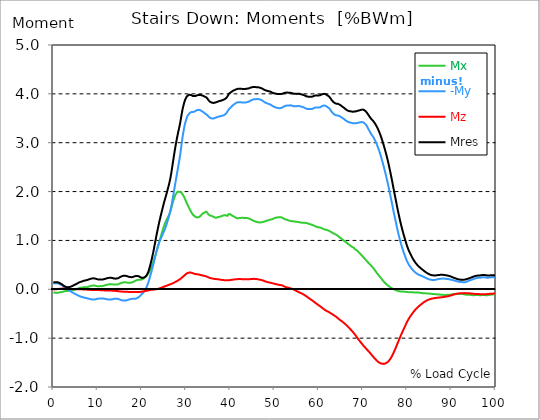
| Category |  Mx |  -My |  Mz |  Mres |
|---|---|---|---|---|
| 0.0 | -0.069 | 0.125 | -0.004 | 0.145 |
| 0.167348456675344 | -0.065 | 0.124 | -0.002 | 0.143 |
| 0.334696913350688 | -0.067 | 0.124 | -0.001 | 0.144 |
| 0.5020453700260321 | -0.072 | 0.125 | 0 | 0.147 |
| 0.669393826701376 | -0.074 | 0.124 | 0.002 | 0.147 |
| 0.83674228337672 | -0.074 | 0.123 | 0.004 | 0.145 |
| 1.0040907400520642 | -0.071 | 0.121 | 0.006 | 0.143 |
| 1.1621420602454444 | -0.068 | 0.117 | 0.007 | 0.137 |
| 1.3294905169207885 | -0.065 | 0.111 | 0.009 | 0.131 |
| 1.4968389735961325 | -0.064 | 0.105 | 0.011 | 0.124 |
| 1.6641874302714765 | -0.061 | 0.096 | 0.012 | 0.116 |
| 1.8315358869468206 | -0.058 | 0.088 | 0.013 | 0.107 |
| 1.9988843436221646 | -0.054 | 0.078 | 0.014 | 0.097 |
| 2.1662328002975086 | -0.05 | 0.066 | 0.014 | 0.086 |
| 2.333581256972853 | -0.044 | 0.052 | 0.013 | 0.073 |
| 2.5009297136481967 | -0.038 | 0.037 | 0.012 | 0.062 |
| 2.6682781703235405 | -0.036 | 0.024 | 0.012 | 0.055 |
| 2.8356266269988843 | -0.035 | 0.017 | 0.011 | 0.05 |
| 3.002975083674229 | -0.034 | 0.009 | 0.011 | 0.045 |
| 3.1703235403495724 | -0.033 | -0.001 | 0.01 | 0.043 |
| 3.337671997024917 | -0.033 | -0.011 | 0.01 | 0.043 |
| 3.4957233172182973 | -0.032 | -0.021 | 0.009 | 0.044 |
| 3.663071773893641 | -0.028 | -0.03 | 0.009 | 0.047 |
| 3.8304202305689854 | -0.025 | -0.039 | 0.008 | 0.051 |
| 3.997768687244329 | -0.023 | -0.048 | 0.007 | 0.056 |
| 4.165117143919673 | -0.021 | -0.057 | 0.007 | 0.063 |
| 4.332465600595017 | -0.018 | -0.066 | 0.007 | 0.071 |
| 4.499814057270361 | -0.015 | -0.076 | 0.005 | 0.079 |
| 4.667162513945706 | -0.013 | -0.083 | 0.004 | 0.086 |
| 4.834510970621049 | -0.009 | -0.091 | 0.003 | 0.093 |
| 5.001859427296393 | -0.003 | -0.097 | 0.003 | 0.099 |
| 5.169207883971737 | 0.004 | -0.106 | 0.003 | 0.107 |
| 5.336556340647081 | 0.009 | -0.115 | 0.002 | 0.116 |
| 5.503904797322425 | 0.015 | -0.122 | 0.002 | 0.124 |
| 5.671253253997769 | 0.02 | -0.13 | 0.002 | 0.133 |
| 5.82930457419115 | 0.024 | -0.136 | 0.001 | 0.139 |
| 5.996653030866494 | 0.029 | -0.143 | 0.001 | 0.147 |
| 6.164001487541838 | 0.032 | -0.148 | 0.001 | 0.152 |
| 6.331349944217181 | 0.033 | -0.153 | 0 | 0.157 |
| 6.498698400892526 | 0.035 | -0.158 | -0.001 | 0.163 |
| 6.66604685756787 | 0.037 | -0.163 | -0.003 | 0.167 |
| 6.833395314243213 | 0.04 | -0.167 | -0.004 | 0.172 |
| 7.000743770918558 | 0.045 | -0.171 | -0.005 | 0.178 |
| 7.168092227593902 | 0.045 | -0.175 | -0.005 | 0.18 |
| 7.335440684269246 | 0.042 | -0.178 | -0.006 | 0.183 |
| 7.50278914094459 | 0.041 | -0.181 | -0.006 | 0.186 |
| 7.6701375976199335 | 0.044 | -0.185 | -0.007 | 0.191 |
| 7.837486054295278 | 0.05 | -0.189 | -0.008 | 0.196 |
| 7.995537374488658 | 0.055 | -0.193 | -0.009 | 0.202 |
| 8.162885831164003 | 0.061 | -0.197 | -0.01 | 0.207 |
| 8.330234287839346 | 0.065 | -0.201 | -0.012 | 0.212 |
| 8.49758274451469 | 0.069 | -0.205 | -0.012 | 0.217 |
| 8.664931201190035 | 0.073 | -0.207 | -0.012 | 0.221 |
| 8.832279657865378 | 0.076 | -0.209 | -0.013 | 0.223 |
| 8.999628114540721 | 0.077 | -0.21 | -0.013 | 0.224 |
| 9.166976571216066 | 0.078 | -0.21 | -0.013 | 0.225 |
| 9.334325027891412 | 0.076 | -0.208 | -0.013 | 0.222 |
| 9.501673484566755 | 0.072 | -0.206 | -0.013 | 0.219 |
| 9.669021941242098 | 0.067 | -0.201 | -0.014 | 0.213 |
| 9.836370397917442 | 0.064 | -0.196 | -0.014 | 0.207 |
| 10.003718854592787 | 0.062 | -0.193 | -0.015 | 0.204 |
| 10.17106731126813 | 0.06 | -0.191 | -0.016 | 0.201 |
| 10.329118631461512 | 0.061 | -0.191 | -0.017 | 0.201 |
| 10.496467088136853 | 0.065 | -0.191 | -0.017 | 0.203 |
| 10.663815544812199 | 0.065 | -0.19 | -0.018 | 0.202 |
| 10.831164001487544 | 0.064 | -0.188 | -0.018 | 0.199 |
| 10.998512458162887 | 0.064 | -0.188 | -0.019 | 0.199 |
| 11.16586091483823 | 0.066 | -0.188 | -0.021 | 0.201 |
| 11.333209371513574 | 0.071 | -0.19 | -0.021 | 0.204 |
| 11.50055782818892 | 0.076 | -0.192 | -0.022 | 0.207 |
| 11.667906284864264 | 0.081 | -0.194 | -0.023 | 0.212 |
| 11.835254741539607 | 0.086 | -0.198 | -0.023 | 0.218 |
| 12.00260319821495 | 0.091 | -0.202 | -0.024 | 0.222 |
| 12.169951654890292 | 0.094 | -0.205 | -0.024 | 0.227 |
| 12.337300111565641 | 0.097 | -0.207 | -0.025 | 0.231 |
| 12.504648568240984 | 0.1 | -0.209 | -0.025 | 0.234 |
| 12.662699888434362 | 0.102 | -0.209 | -0.026 | 0.235 |
| 12.830048345109708 | 0.104 | -0.21 | -0.026 | 0.236 |
| 12.997396801785053 | 0.105 | -0.209 | -0.026 | 0.236 |
| 13.164745258460396 | 0.104 | -0.207 | -0.027 | 0.234 |
| 13.33209371513574 | 0.101 | -0.205 | -0.028 | 0.231 |
| 13.499442171811083 | 0.098 | -0.201 | -0.029 | 0.226 |
| 13.666790628486426 | 0.096 | -0.196 | -0.03 | 0.221 |
| 13.834139085161771 | 0.095 | -0.193 | -0.031 | 0.219 |
| 14.001487541837117 | 0.095 | -0.193 | -0.033 | 0.218 |
| 14.16883599851246 | 0.095 | -0.193 | -0.034 | 0.218 |
| 14.336184455187803 | 0.096 | -0.193 | -0.036 | 0.22 |
| 14.503532911863147 | 0.099 | -0.195 | -0.037 | 0.223 |
| 14.670881368538492 | 0.104 | -0.198 | -0.038 | 0.228 |
| 14.828932688731873 | 0.109 | -0.203 | -0.04 | 0.236 |
| 14.996281145407215 | 0.117 | -0.209 | -0.043 | 0.245 |
| 15.163629602082558 | 0.123 | -0.216 | -0.045 | 0.254 |
| 15.330978058757903 | 0.129 | -0.221 | -0.046 | 0.262 |
| 15.498326515433247 | 0.134 | -0.226 | -0.047 | 0.268 |
| 15.665674972108594 | 0.137 | -0.229 | -0.048 | 0.273 |
| 15.833023428783937 | 0.141 | -0.231 | -0.049 | 0.276 |
| 16.00037188545928 | 0.142 | -0.232 | -0.05 | 0.278 |
| 16.167720342134626 | 0.142 | -0.231 | -0.05 | 0.277 |
| 16.335068798809967 | 0.142 | -0.23 | -0.05 | 0.276 |
| 16.502417255485312 | 0.14 | -0.228 | -0.051 | 0.273 |
| 16.669765712160658 | 0.137 | -0.224 | -0.052 | 0.269 |
| 16.837114168836 | 0.135 | -0.219 | -0.052 | 0.264 |
| 17.004462625511344 | 0.133 | -0.212 | -0.053 | 0.257 |
| 17.16251394570472 | 0.132 | -0.207 | -0.054 | 0.253 |
| 17.32986240238007 | 0.133 | -0.203 | -0.054 | 0.25 |
| 17.497210859055414 | 0.135 | -0.199 | -0.055 | 0.249 |
| 17.664559315730756 | 0.137 | -0.196 | -0.056 | 0.248 |
| 17.8319077724061 | 0.143 | -0.195 | -0.056 | 0.25 |
| 17.999256229081443 | 0.149 | -0.194 | -0.057 | 0.252 |
| 18.166604685756788 | 0.156 | -0.195 | -0.057 | 0.258 |
| 18.333953142432133 | 0.165 | -0.195 | -0.058 | 0.264 |
| 18.501301599107478 | 0.173 | -0.195 | -0.058 | 0.27 |
| 18.668650055782823 | 0.179 | -0.192 | -0.058 | 0.273 |
| 18.835998512458165 | 0.186 | -0.185 | -0.057 | 0.273 |
| 19.00334696913351 | 0.191 | -0.175 | -0.056 | 0.273 |
| 19.170695425808855 | 0.194 | -0.167 | -0.055 | 0.271 |
| 19.338043882484197 | 0.194 | -0.158 | -0.054 | 0.265 |
| 19.496095202677576 | 0.194 | -0.147 | -0.054 | 0.258 |
| 19.66344365935292 | 0.194 | -0.132 | -0.053 | 0.248 |
| 19.830792116028263 | 0.194 | -0.115 | -0.051 | 0.238 |
| 19.998140572703612 | 0.201 | -0.096 | -0.048 | 0.234 |
| 20.165489029378953 | 0.207 | -0.082 | -0.047 | 0.234 |
| 20.3328374860543 | 0.217 | -0.067 | -0.045 | 0.236 |
| 20.500185942729644 | 0.228 | -0.049 | -0.042 | 0.24 |
| 20.667534399404985 | 0.24 | -0.022 | -0.038 | 0.249 |
| 20.83488285608033 | 0.252 | 0 | -0.036 | 0.26 |
| 21.002231312755672 | 0.267 | 0.028 | -0.033 | 0.277 |
| 21.16957976943102 | 0.283 | 0.063 | -0.029 | 0.3 |
| 21.336928226106362 | 0.303 | 0.103 | -0.025 | 0.33 |
| 21.504276682781704 | 0.325 | 0.147 | -0.021 | 0.365 |
| 21.67162513945705 | 0.353 | 0.199 | -0.019 | 0.415 |
| 21.82967645965043 | 0.386 | 0.25 | -0.016 | 0.468 |
| 21.997024916325774 | 0.421 | 0.304 | -0.013 | 0.526 |
| 22.16437337300112 | 0.456 | 0.359 | -0.011 | 0.588 |
| 22.33172182967646 | 0.493 | 0.415 | -0.009 | 0.652 |
| 22.499070286351806 | 0.535 | 0.474 | -0.007 | 0.722 |
| 22.666418743027148 | 0.579 | 0.535 | -0.007 | 0.796 |
| 22.833767199702496 | 0.627 | 0.598 | -0.005 | 0.875 |
| 23.00111565637784 | 0.676 | 0.662 | -0.003 | 0.954 |
| 23.168464113053183 | 0.726 | 0.723 | -0.001 | 1.033 |
| 23.335812569728528 | 0.778 | 0.781 | 0.001 | 1.111 |
| 23.50316102640387 | 0.832 | 0.835 | 0.004 | 1.187 |
| 23.670509483079215 | 0.883 | 0.885 | 0.008 | 1.26 |
| 23.83785793975456 | 0.938 | 0.932 | 0.014 | 1.332 |
| 23.995909259947936 | 0.992 | 0.977 | 0.02 | 1.401 |
| 24.163257716623285 | 1.043 | 1.012 | 0.024 | 1.464 |
| 24.330606173298627 | 1.093 | 1.046 | 0.03 | 1.524 |
| 24.49795462997397 | 1.144 | 1.081 | 0.036 | 1.587 |
| 24.665303086649313 | 1.194 | 1.116 | 0.041 | 1.649 |
| 24.83265154332466 | 1.245 | 1.151 | 0.048 | 1.71 |
| 25.0 | 1.29 | 1.188 | 0.052 | 1.768 |
| 25.167348456675345 | 1.333 | 1.222 | 0.059 | 1.822 |
| 25.334696913350694 | 1.367 | 1.261 | 0.064 | 1.874 |
| 25.502045370026035 | 1.402 | 1.302 | 0.069 | 1.926 |
| 25.669393826701377 | 1.435 | 1.349 | 0.075 | 1.982 |
| 25.836742283376722 | 1.465 | 1.399 | 0.081 | 2.038 |
| 26.004090740052067 | 1.495 | 1.452 | 0.087 | 2.096 |
| 26.17143919672741 | 1.523 | 1.507 | 0.093 | 2.155 |
| 26.329490516920792 | 1.562 | 1.564 | 0.098 | 2.221 |
| 26.49683897359613 | 1.607 | 1.624 | 0.105 | 2.296 |
| 26.66418743027148 | 1.662 | 1.696 | 0.11 | 2.385 |
| 26.831535886946828 | 1.718 | 1.774 | 0.117 | 2.479 |
| 26.998884343622166 | 1.774 | 1.864 | 0.123 | 2.58 |
| 27.166232800297514 | 1.825 | 1.95 | 0.13 | 2.678 |
| 27.333581256972852 | 1.869 | 2.04 | 0.137 | 2.773 |
| 27.5009297136482 | 1.91 | 2.13 | 0.145 | 2.866 |
| 27.668278170323543 | 1.944 | 2.219 | 0.153 | 2.955 |
| 27.835626626998888 | 1.967 | 2.306 | 0.162 | 3.037 |
| 28.002975083674233 | 1.988 | 2.393 | 0.171 | 3.117 |
| 28.170323540349575 | 2 | 2.479 | 0.181 | 3.192 |
| 28.33767199702492 | 2 | 2.565 | 0.19 | 3.261 |
| 28.50502045370026 | 1.998 | 2.653 | 0.198 | 3.33 |
| 28.663071773893645 | 1.993 | 2.749 | 0.208 | 3.405 |
| 28.830420230568986 | 1.984 | 2.859 | 0.22 | 3.49 |
| 28.99776868724433 | 1.971 | 2.977 | 0.233 | 3.579 |
| 29.165117143919673 | 1.954 | 3.088 | 0.247 | 3.664 |
| 29.33246560059502 | 1.928 | 3.183 | 0.261 | 3.733 |
| 29.499814057270367 | 1.899 | 3.271 | 0.275 | 3.793 |
| 29.66716251394571 | 1.868 | 3.348 | 0.287 | 3.846 |
| 29.834510970621054 | 1.833 | 3.414 | 0.302 | 3.888 |
| 30.00185942729639 | 1.799 | 3.465 | 0.313 | 3.919 |
| 30.169207883971744 | 1.764 | 3.512 | 0.322 | 3.945 |
| 30.33655634064708 | 1.732 | 3.547 | 0.332 | 3.963 |
| 30.50390479732243 | 1.7 | 3.573 | 0.337 | 3.973 |
| 30.671253253997772 | 1.67 | 3.592 | 0.341 | 3.979 |
| 30.829304574191156 | 1.64 | 3.607 | 0.344 | 3.98 |
| 30.996653030866494 | 1.612 | 3.619 | 0.344 | 3.979 |
| 31.164001487541842 | 1.584 | 3.626 | 0.341 | 3.976 |
| 31.331349944217187 | 1.557 | 3.628 | 0.336 | 3.966 |
| 31.498698400892525 | 1.536 | 3.627 | 0.328 | 3.958 |
| 31.666046857567874 | 1.516 | 3.63 | 0.323 | 3.953 |
| 31.833395314243212 | 1.504 | 3.636 | 0.319 | 3.954 |
| 32.00074377091856 | 1.494 | 3.642 | 0.314 | 3.956 |
| 32.1680922275939 | 1.48 | 3.65 | 0.31 | 3.958 |
| 32.33544068426925 | 1.474 | 3.661 | 0.309 | 3.965 |
| 32.50278914094459 | 1.471 | 3.668 | 0.307 | 3.971 |
| 32.670137597619934 | 1.47 | 3.673 | 0.306 | 3.975 |
| 32.83748605429528 | 1.475 | 3.673 | 0.303 | 3.977 |
| 33.004834510970625 | 1.479 | 3.674 | 0.3 | 3.979 |
| 33.162885831164004 | 1.493 | 3.668 | 0.295 | 3.977 |
| 33.33023428783935 | 1.511 | 3.661 | 0.292 | 3.976 |
| 33.497582744514695 | 1.527 | 3.651 | 0.287 | 3.972 |
| 33.664931201190036 | 1.542 | 3.64 | 0.283 | 3.967 |
| 33.83227965786538 | 1.553 | 3.63 | 0.279 | 3.961 |
| 33.99962811454073 | 1.558 | 3.62 | 0.278 | 3.953 |
| 34.16697657121607 | 1.568 | 3.608 | 0.273 | 3.947 |
| 34.33432502789141 | 1.579 | 3.596 | 0.269 | 3.94 |
| 34.50167348456676 | 1.589 | 3.584 | 0.264 | 3.933 |
| 34.6690219412421 | 1.589 | 3.571 | 0.261 | 3.921 |
| 34.83637039791744 | 1.567 | 3.563 | 0.255 | 3.905 |
| 35.00371885459279 | 1.536 | 3.547 | 0.247 | 3.879 |
| 35.17106731126814 | 1.523 | 3.529 | 0.24 | 3.859 |
| 35.338415767943474 | 1.514 | 3.514 | 0.235 | 3.842 |
| 35.49646708813686 | 1.511 | 3.506 | 0.23 | 3.834 |
| 35.6638155448122 | 1.506 | 3.5 | 0.226 | 3.826 |
| 35.831164001487544 | 1.497 | 3.497 | 0.223 | 3.821 |
| 35.998512458162885 | 1.491 | 3.493 | 0.22 | 3.815 |
| 36.165860914838234 | 1.487 | 3.494 | 0.216 | 3.814 |
| 36.333209371513576 | 1.48 | 3.499 | 0.213 | 3.816 |
| 36.50055782818892 | 1.471 | 3.506 | 0.212 | 3.82 |
| 36.667906284864266 | 1.464 | 3.513 | 0.211 | 3.823 |
| 36.83525474153961 | 1.464 | 3.519 | 0.21 | 3.829 |
| 37.002603198214956 | 1.469 | 3.523 | 0.207 | 3.836 |
| 37.1699516548903 | 1.473 | 3.528 | 0.206 | 3.84 |
| 37.337300111565646 | 1.479 | 3.532 | 0.204 | 3.846 |
| 37.50464856824098 | 1.482 | 3.537 | 0.201 | 3.851 |
| 37.66269988843437 | 1.486 | 3.54 | 0.198 | 3.855 |
| 37.83004834510971 | 1.491 | 3.544 | 0.196 | 3.859 |
| 37.99739680178505 | 1.496 | 3.548 | 0.193 | 3.864 |
| 38.16474525846039 | 1.502 | 3.551 | 0.191 | 3.869 |
| 38.33209371513574 | 1.508 | 3.555 | 0.189 | 3.875 |
| 38.49944217181109 | 1.515 | 3.561 | 0.188 | 3.881 |
| 38.666790628486424 | 1.516 | 3.569 | 0.187 | 3.889 |
| 38.83413908516178 | 1.515 | 3.579 | 0.186 | 3.896 |
| 39.001487541837115 | 1.516 | 3.592 | 0.186 | 3.908 |
| 39.16883599851246 | 1.512 | 3.609 | 0.185 | 3.922 |
| 39.336184455187805 | 1.503 | 3.629 | 0.182 | 3.936 |
| 39.503532911863154 | 1.516 | 3.659 | 0.181 | 3.968 |
| 39.670881368538495 | 1.541 | 3.684 | 0.184 | 4.001 |
| 39.83822982521384 | 1.544 | 3.699 | 0.187 | 4.015 |
| 39.996281145407224 | 1.536 | 3.712 | 0.19 | 4.024 |
| 40.163629602082565 | 1.524 | 3.727 | 0.192 | 4.034 |
| 40.33097805875791 | 1.512 | 3.743 | 0.193 | 4.044 |
| 40.498326515433256 | 1.505 | 3.76 | 0.194 | 4.056 |
| 40.6656749721086 | 1.497 | 3.773 | 0.197 | 4.066 |
| 40.83302342878393 | 1.486 | 3.785 | 0.2 | 4.074 |
| 41.00037188545929 | 1.478 | 3.794 | 0.203 | 4.079 |
| 41.16772034213463 | 1.469 | 3.805 | 0.203 | 4.086 |
| 41.33506879880997 | 1.462 | 3.815 | 0.204 | 4.093 |
| 41.50241725548531 | 1.455 | 3.823 | 0.206 | 4.098 |
| 41.66976571216066 | 1.452 | 3.828 | 0.207 | 4.102 |
| 41.837114168836 | 1.458 | 3.828 | 0.21 | 4.104 |
| 42.004462625511344 | 1.457 | 3.83 | 0.21 | 4.106 |
| 42.17181108218669 | 1.456 | 3.831 | 0.211 | 4.106 |
| 42.32986240238007 | 1.461 | 3.827 | 0.209 | 4.105 |
| 42.497210859055414 | 1.464 | 3.824 | 0.207 | 4.103 |
| 42.66455931573076 | 1.464 | 3.823 | 0.207 | 4.102 |
| 42.831907772406105 | 1.462 | 3.823 | 0.205 | 4.101 |
| 42.999256229081446 | 1.461 | 3.825 | 0.205 | 4.102 |
| 43.16660468575679 | 1.461 | 3.823 | 0.204 | 4.101 |
| 43.33395314243214 | 1.462 | 3.822 | 0.206 | 4.1 |
| 43.50130159910748 | 1.461 | 3.824 | 0.204 | 4.101 |
| 43.66865005578282 | 1.461 | 3.827 | 0.205 | 4.105 |
| 43.83599851245817 | 1.458 | 3.83 | 0.206 | 4.106 |
| 44.00334696913351 | 1.454 | 3.835 | 0.206 | 4.108 |
| 44.17069542580886 | 1.45 | 3.84 | 0.205 | 4.112 |
| 44.3380438824842 | 1.444 | 3.848 | 0.206 | 4.118 |
| 44.49609520267758 | 1.437 | 3.858 | 0.209 | 4.124 |
| 44.66344365935292 | 1.428 | 3.866 | 0.211 | 4.13 |
| 44.83079211602827 | 1.421 | 3.874 | 0.21 | 4.134 |
| 44.99814057270361 | 1.414 | 3.879 | 0.211 | 4.137 |
| 45.16548902937895 | 1.407 | 3.884 | 0.213 | 4.139 |
| 45.332837486054295 | 1.399 | 3.888 | 0.214 | 4.14 |
| 45.500185942729644 | 1.393 | 3.89 | 0.213 | 4.139 |
| 45.66753439940499 | 1.388 | 3.891 | 0.212 | 4.138 |
| 45.83488285608033 | 1.383 | 3.892 | 0.212 | 4.137 |
| 46.00223131275568 | 1.378 | 3.893 | 0.208 | 4.136 |
| 46.16957976943102 | 1.374 | 3.893 | 0.206 | 4.136 |
| 46.336928226106366 | 1.371 | 3.893 | 0.202 | 4.135 |
| 46.50427668278171 | 1.37 | 3.89 | 0.2 | 4.131 |
| 46.671625139457056 | 1.368 | 3.886 | 0.197 | 4.127 |
| 46.829676459650436 | 1.368 | 3.881 | 0.194 | 4.122 |
| 46.99702491632577 | 1.37 | 3.875 | 0.192 | 4.117 |
| 47.16437337300112 | 1.374 | 3.866 | 0.187 | 4.11 |
| 47.33172182967646 | 1.379 | 3.857 | 0.182 | 4.103 |
| 47.49907028635181 | 1.381 | 3.847 | 0.177 | 4.093 |
| 47.66641874302716 | 1.385 | 3.836 | 0.169 | 4.084 |
| 47.83376719970249 | 1.391 | 3.826 | 0.164 | 4.077 |
| 48.001115656377834 | 1.396 | 3.819 | 0.159 | 4.072 |
| 48.16846411305319 | 1.402 | 3.812 | 0.154 | 4.067 |
| 48.33581256972853 | 1.407 | 3.805 | 0.15 | 4.062 |
| 48.50316102640387 | 1.41 | 3.8 | 0.146 | 4.058 |
| 48.67050948307921 | 1.414 | 3.795 | 0.142 | 4.055 |
| 48.837857939754564 | 1.42 | 3.791 | 0.139 | 4.052 |
| 49.005206396429905 | 1.424 | 3.783 | 0.136 | 4.048 |
| 49.163257716623285 | 1.426 | 3.776 | 0.132 | 4.041 |
| 49.33060617329863 | 1.431 | 3.765 | 0.128 | 4.033 |
| 49.49795462997397 | 1.436 | 3.755 | 0.124 | 4.025 |
| 49.66530308664932 | 1.442 | 3.745 | 0.121 | 4.018 |
| 49.832651543324666 | 1.449 | 3.737 | 0.117 | 4.014 |
| 50.0 | 1.457 | 3.731 | 0.112 | 4.009 |
| 50.16734845667534 | 1.464 | 3.723 | 0.108 | 4.006 |
| 50.33469691335069 | 1.466 | 3.72 | 0.105 | 4.003 |
| 50.50204537002604 | 1.468 | 3.715 | 0.101 | 4 |
| 50.66939382670139 | 1.47 | 3.712 | 0.098 | 3.998 |
| 50.836742283376715 | 1.473 | 3.709 | 0.094 | 3.996 |
| 51.00409074005207 | 1.476 | 3.707 | 0.092 | 3.995 |
| 51.17143919672741 | 1.478 | 3.707 | 0.089 | 3.995 |
| 51.32949051692079 | 1.477 | 3.708 | 0.086 | 3.997 |
| 51.496838973596134 | 1.474 | 3.711 | 0.084 | 3.998 |
| 51.66418743027148 | 1.469 | 3.716 | 0.082 | 4 |
| 51.831535886946824 | 1.463 | 3.723 | 0.079 | 4.005 |
| 51.99888434362217 | 1.451 | 3.734 | 0.07 | 4.01 |
| 52.16623280029752 | 1.444 | 3.742 | 0.062 | 4.015 |
| 52.33358125697285 | 1.436 | 3.75 | 0.051 | 4.021 |
| 52.5009297136482 | 1.43 | 3.756 | 0.043 | 4.023 |
| 52.668278170323546 | 1.425 | 3.759 | 0.04 | 4.025 |
| 52.835626626998895 | 1.421 | 3.762 | 0.038 | 4.026 |
| 53.00297508367424 | 1.417 | 3.762 | 0.035 | 4.025 |
| 53.17032354034958 | 1.412 | 3.763 | 0.031 | 4.023 |
| 53.33767199702492 | 1.407 | 3.763 | 0.028 | 4.021 |
| 53.50502045370027 | 1.402 | 3.764 | 0.023 | 4.021 |
| 53.663071773893655 | 1.396 | 3.765 | 0.018 | 4.021 |
| 53.83042023056899 | 1.393 | 3.762 | 0.013 | 4.016 |
| 53.99776868724433 | 1.392 | 3.757 | 0.007 | 4.012 |
| 54.16511714391967 | 1.391 | 3.752 | 0.001 | 4.007 |
| 54.33246560059503 | 1.392 | 3.748 | -0.007 | 4.004 |
| 54.49981405727037 | 1.389 | 3.748 | -0.013 | 4.003 |
| 54.667162513945705 | 1.386 | 3.748 | -0.02 | 4.003 |
| 54.834510970621054 | 1.382 | 3.748 | -0.028 | 4.001 |
| 55.0018594272964 | 1.381 | 3.746 | -0.036 | 3.999 |
| 55.169207883971744 | 1.379 | 3.751 | -0.043 | 4.004 |
| 55.336556340647086 | 1.377 | 3.752 | -0.051 | 4.005 |
| 55.50390479732243 | 1.374 | 3.75 | -0.059 | 4.003 |
| 55.671253253997776 | 1.371 | 3.75 | -0.065 | 4.001 |
| 55.83860171067312 | 1.369 | 3.747 | -0.071 | 3.997 |
| 55.9966530308665 | 1.366 | 3.739 | -0.078 | 3.991 |
| 56.16400148754184 | 1.363 | 3.735 | -0.085 | 3.985 |
| 56.33134994421718 | 1.361 | 3.733 | -0.094 | 3.983 |
| 56.498698400892536 | 1.362 | 3.728 | -0.103 | 3.979 |
| 56.66604685756788 | 1.364 | 3.721 | -0.111 | 3.974 |
| 56.83339531424321 | 1.363 | 3.712 | -0.121 | 3.966 |
| 57.00074377091856 | 1.36 | 3.704 | -0.131 | 3.958 |
| 57.16809222759391 | 1.357 | 3.697 | -0.139 | 3.951 |
| 57.33544068426925 | 1.353 | 3.693 | -0.15 | 3.947 |
| 57.5027891409446 | 1.346 | 3.69 | -0.164 | 3.944 |
| 57.670137597619934 | 1.343 | 3.688 | -0.174 | 3.942 |
| 57.83748605429528 | 1.339 | 3.689 | -0.184 | 3.942 |
| 58.004834510970625 | 1.335 | 3.688 | -0.195 | 3.941 |
| 58.16288583116401 | 1.329 | 3.688 | -0.206 | 3.94 |
| 58.330234287839346 | 1.323 | 3.688 | -0.216 | 3.939 |
| 58.497582744514695 | 1.318 | 3.69 | -0.226 | 3.94 |
| 58.66493120119004 | 1.313 | 3.696 | -0.237 | 3.946 |
| 58.832279657865385 | 1.308 | 3.704 | -0.25 | 3.952 |
| 58.999628114540734 | 1.3 | 3.714 | -0.262 | 3.962 |
| 59.16697657121607 | 1.292 | 3.719 | -0.273 | 3.965 |
| 59.33432502789142 | 1.285 | 3.721 | -0.284 | 3.966 |
| 59.50167348456676 | 1.279 | 3.722 | -0.294 | 3.967 |
| 59.66902194124211 | 1.274 | 3.722 | -0.306 | 3.967 |
| 59.83637039791745 | 1.271 | 3.721 | -0.317 | 3.967 |
| 60.00371885459278 | 1.268 | 3.721 | -0.328 | 3.967 |
| 60.17106731126813 | 1.266 | 3.722 | -0.338 | 3.97 |
| 60.33841576794349 | 1.264 | 3.725 | -0.35 | 3.973 |
| 60.49646708813685 | 1.258 | 3.734 | -0.361 | 3.979 |
| 60.6638155448122 | 1.251 | 3.743 | -0.372 | 3.987 |
| 60.831164001487544 | 1.244 | 3.751 | -0.383 | 3.993 |
| 60.99851245816289 | 1.236 | 3.759 | -0.395 | 3.999 |
| 61.16586091483824 | 1.231 | 3.762 | -0.407 | 4.002 |
| 61.333209371513576 | 1.227 | 3.76 | -0.418 | 4 |
| 61.50055782818892 | 1.223 | 3.755 | -0.428 | 3.995 |
| 61.667906284864266 | 1.218 | 3.748 | -0.437 | 3.988 |
| 61.835254741539615 | 1.211 | 3.738 | -0.446 | 3.978 |
| 62.002603198214956 | 1.207 | 3.729 | -0.452 | 3.967 |
| 62.16995165489029 | 1.204 | 3.719 | -0.459 | 3.957 |
| 62.33730011156564 | 1.197 | 3.707 | -0.468 | 3.945 |
| 62.504648568240995 | 1.189 | 3.692 | -0.479 | 3.93 |
| 62.67199702491633 | 1.18 | 3.671 | -0.488 | 3.909 |
| 62.83004834510971 | 1.171 | 3.649 | -0.498 | 3.887 |
| 62.99739680178505 | 1.162 | 3.624 | -0.507 | 3.864 |
| 63.1647452584604 | 1.153 | 3.606 | -0.517 | 3.845 |
| 63.33209371513575 | 1.145 | 3.593 | -0.527 | 3.832 |
| 63.4994421718111 | 1.137 | 3.581 | -0.536 | 3.82 |
| 63.666790628486424 | 1.131 | 3.571 | -0.546 | 3.81 |
| 63.83413908516177 | 1.124 | 3.564 | -0.557 | 3.803 |
| 64.00148754183712 | 1.115 | 3.56 | -0.566 | 3.797 |
| 64.16883599851248 | 1.106 | 3.559 | -0.579 | 3.796 |
| 64.3361844551878 | 1.094 | 3.557 | -0.593 | 3.795 |
| 64.50353291186315 | 1.079 | 3.551 | -0.607 | 3.79 |
| 64.6708813685385 | 1.066 | 3.545 | -0.618 | 3.782 |
| 64.83822982521384 | 1.055 | 3.537 | -0.629 | 3.774 |
| 65.00557828188919 | 1.044 | 3.527 | -0.641 | 3.763 |
| 65.16362960208257 | 1.034 | 3.517 | -0.65 | 3.75 |
| 65.3309780587579 | 1.022 | 3.507 | -0.662 | 3.739 |
| 65.49832651543326 | 1.008 | 3.497 | -0.675 | 3.729 |
| 65.6656749721086 | 0.997 | 3.488 | -0.688 | 3.718 |
| 65.83302342878395 | 0.985 | 3.477 | -0.7 | 3.706 |
| 66.00037188545929 | 0.974 | 3.464 | -0.712 | 3.691 |
| 66.16772034213463 | 0.963 | 3.451 | -0.726 | 3.679 |
| 66.33506879880998 | 0.95 | 3.442 | -0.74 | 3.668 |
| 66.50241725548531 | 0.936 | 3.433 | -0.755 | 3.66 |
| 66.66976571216065 | 0.925 | 3.425 | -0.77 | 3.653 |
| 66.83711416883601 | 0.915 | 3.419 | -0.785 | 3.647 |
| 67.00446262551135 | 0.905 | 3.414 | -0.801 | 3.643 |
| 67.1718110821867 | 0.893 | 3.412 | -0.817 | 3.642 |
| 67.32986240238007 | 0.879 | 3.409 | -0.835 | 3.641 |
| 67.49721085905541 | 0.87 | 3.406 | -0.851 | 3.637 |
| 67.66455931573076 | 0.862 | 3.401 | -0.867 | 3.634 |
| 67.83190777240611 | 0.857 | 3.401 | -0.886 | 3.636 |
| 67.99925622908145 | 0.843 | 3.4 | -0.906 | 3.637 |
| 68.16660468575678 | 0.822 | 3.398 | -0.925 | 3.637 |
| 68.33395314243214 | 0.811 | 3.398 | -0.945 | 3.64 |
| 68.50130159910749 | 0.805 | 3.399 | -0.964 | 3.644 |
| 68.66865005578282 | 0.793 | 3.404 | -0.986 | 3.65 |
| 68.83599851245816 | 0.779 | 3.407 | -1.007 | 3.653 |
| 69.00334696913352 | 0.764 | 3.409 | -1.028 | 3.657 |
| 69.17069542580886 | 0.749 | 3.414 | -1.048 | 3.663 |
| 69.3380438824842 | 0.733 | 3.417 | -1.067 | 3.666 |
| 69.50539233915956 | 0.716 | 3.419 | -1.086 | 3.671 |
| 69.66344365935292 | 0.699 | 3.422 | -1.104 | 3.676 |
| 69.83079211602826 | 0.683 | 3.426 | -1.122 | 3.681 |
| 69.99814057270362 | 0.666 | 3.421 | -1.141 | 3.679 |
| 70.16548902937896 | 0.65 | 3.412 | -1.159 | 3.673 |
| 70.33283748605429 | 0.634 | 3.401 | -1.177 | 3.665 |
| 70.50018594272964 | 0.617 | 3.386 | -1.193 | 3.654 |
| 70.667534399405 | 0.599 | 3.368 | -1.21 | 3.64 |
| 70.83488285608033 | 0.58 | 3.347 | -1.227 | 3.622 |
| 71.00223131275568 | 0.564 | 3.322 | -1.243 | 3.602 |
| 71.16957976943102 | 0.549 | 3.293 | -1.258 | 3.579 |
| 71.33692822610637 | 0.533 | 3.264 | -1.275 | 3.555 |
| 71.50427668278171 | 0.517 | 3.235 | -1.292 | 3.533 |
| 71.67162513945706 | 0.501 | 3.205 | -1.309 | 3.51 |
| 71.8389735961324 | 0.485 | 3.179 | -1.327 | 3.491 |
| 71.99702491632577 | 0.469 | 3.159 | -1.346 | 3.475 |
| 72.16437337300113 | 0.452 | 3.138 | -1.364 | 3.46 |
| 72.33172182967647 | 0.436 | 3.115 | -1.382 | 3.442 |
| 72.49907028635181 | 0.416 | 3.087 | -1.4 | 3.421 |
| 72.66641874302715 | 0.394 | 3.06 | -1.417 | 3.4 |
| 72.8337671997025 | 0.373 | 3.029 | -1.433 | 3.377 |
| 73.00111565637783 | 0.352 | 2.996 | -1.449 | 3.35 |
| 73.16846411305319 | 0.332 | 2.958 | -1.464 | 3.321 |
| 73.33581256972853 | 0.313 | 2.92 | -1.479 | 3.292 |
| 73.50316102640387 | 0.293 | 2.879 | -1.489 | 3.259 |
| 73.67050948307921 | 0.275 | 2.835 | -1.499 | 3.223 |
| 73.83785793975457 | 0.256 | 2.788 | -1.508 | 3.185 |
| 74.00520639642991 | 0.236 | 2.74 | -1.515 | 3.145 |
| 74.16325771662328 | 0.218 | 2.69 | -1.521 | 3.102 |
| 74.33060617329863 | 0.198 | 2.635 | -1.524 | 3.054 |
| 74.49795462997398 | 0.179 | 2.579 | -1.526 | 3.006 |
| 74.66530308664932 | 0.162 | 2.522 | -1.527 | 2.957 |
| 74.83265154332466 | 0.145 | 2.464 | -1.524 | 2.905 |
| 75.00000000000001 | 0.129 | 2.405 | -1.521 | 2.851 |
| 75.16734845667534 | 0.114 | 2.343 | -1.514 | 2.795 |
| 75.3346969133507 | 0.1 | 2.279 | -1.506 | 2.737 |
| 75.50204537002605 | 0.087 | 2.216 | -1.495 | 2.678 |
| 75.66939382670138 | 0.075 | 2.15 | -1.484 | 2.617 |
| 75.83674228337672 | 0.064 | 2.079 | -1.468 | 2.55 |
| 76.00409074005208 | 0.053 | 2.007 | -1.448 | 2.479 |
| 76.17143919672742 | 0.043 | 1.935 | -1.426 | 2.407 |
| 76.33878765340276 | 0.033 | 1.86 | -1.403 | 2.333 |
| 76.49683897359614 | 0.022 | 1.785 | -1.378 | 2.257 |
| 76.66418743027148 | 0.013 | 1.71 | -1.349 | 2.18 |
| 76.83153588694682 | 0.005 | 1.635 | -1.317 | 2.102 |
| 76.99888434362218 | -0.002 | 1.561 | -1.284 | 2.023 |
| 77.16623280029752 | -0.008 | 1.489 | -1.25 | 1.947 |
| 77.33358125697285 | -0.015 | 1.421 | -1.216 | 1.873 |
| 77.5009297136482 | -0.021 | 1.35 | -1.179 | 1.795 |
| 77.66827817032356 | -0.026 | 1.276 | -1.141 | 1.715 |
| 77.83562662699889 | -0.032 | 1.208 | -1.104 | 1.64 |
| 78.00297508367423 | -0.037 | 1.145 | -1.068 | 1.569 |
| 78.17032354034959 | -0.041 | 1.083 | -1.032 | 1.499 |
| 78.33767199702493 | -0.044 | 1.023 | -0.995 | 1.431 |
| 78.50502045370027 | -0.045 | 0.966 | -0.959 | 1.365 |
| 78.67236891037561 | -0.046 | 0.912 | -0.924 | 1.303 |
| 78.83042023056899 | -0.046 | 0.862 | -0.891 | 1.244 |
| 78.99776868724433 | -0.047 | 0.813 | -0.857 | 1.186 |
| 79.16511714391969 | -0.048 | 0.768 | -0.824 | 1.131 |
| 79.33246560059503 | -0.049 | 0.726 | -0.792 | 1.079 |
| 79.49981405727036 | -0.05 | 0.683 | -0.759 | 1.027 |
| 79.66716251394571 | -0.052 | 0.643 | -0.726 | 0.976 |
| 79.83451097062107 | -0.054 | 0.605 | -0.694 | 0.927 |
| 80.00185942729641 | -0.056 | 0.57 | -0.664 | 0.881 |
| 80.16920788397174 | -0.058 | 0.538 | -0.635 | 0.839 |
| 80.33655634064709 | -0.059 | 0.51 | -0.608 | 0.801 |
| 80.50390479732243 | -0.059 | 0.486 | -0.583 | 0.766 |
| 80.67125325399778 | -0.059 | 0.464 | -0.56 | 0.735 |
| 80.83860171067312 | -0.058 | 0.444 | -0.539 | 0.706 |
| 80.99665303086651 | -0.059 | 0.423 | -0.516 | 0.675 |
| 81.16400148754184 | -0.061 | 0.404 | -0.494 | 0.645 |
| 81.3313499442172 | -0.062 | 0.387 | -0.474 | 0.619 |
| 81.49869840089255 | -0.063 | 0.371 | -0.455 | 0.594 |
| 81.66604685756786 | -0.064 | 0.358 | -0.436 | 0.572 |
| 81.83339531424322 | -0.064 | 0.345 | -0.419 | 0.55 |
| 82.00074377091858 | -0.066 | 0.333 | -0.402 | 0.529 |
| 82.16809222759392 | -0.067 | 0.321 | -0.386 | 0.51 |
| 82.33544068426926 | -0.067 | 0.311 | -0.372 | 0.493 |
| 82.50278914094459 | -0.067 | 0.303 | -0.358 | 0.477 |
| 82.67013759761994 | -0.067 | 0.296 | -0.345 | 0.463 |
| 82.83748605429528 | -0.069 | 0.29 | -0.332 | 0.449 |
| 83.00483451097062 | -0.073 | 0.283 | -0.319 | 0.436 |
| 83.17218296764597 | -0.076 | 0.277 | -0.307 | 0.423 |
| 83.33023428783935 | -0.078 | 0.271 | -0.294 | 0.411 |
| 83.4975827445147 | -0.079 | 0.264 | -0.282 | 0.399 |
| 83.66493120119004 | -0.081 | 0.258 | -0.272 | 0.387 |
| 83.83227965786537 | -0.082 | 0.25 | -0.262 | 0.375 |
| 83.99962811454073 | -0.082 | 0.242 | -0.251 | 0.363 |
| 84.16697657121607 | -0.083 | 0.236 | -0.243 | 0.352 |
| 84.33432502789142 | -0.084 | 0.228 | -0.235 | 0.342 |
| 84.50167348456677 | -0.085 | 0.221 | -0.227 | 0.333 |
| 84.6690219412421 | -0.086 | 0.214 | -0.22 | 0.323 |
| 84.83637039791745 | -0.087 | 0.208 | -0.213 | 0.314 |
| 85.0037188545928 | -0.089 | 0.203 | -0.207 | 0.307 |
| 85.17106731126813 | -0.091 | 0.199 | -0.202 | 0.301 |
| 85.33841576794349 | -0.092 | 0.195 | -0.197 | 0.295 |
| 85.50576422461883 | -0.093 | 0.193 | -0.193 | 0.291 |
| 85.66381554481221 | -0.094 | 0.191 | -0.19 | 0.287 |
| 85.83116400148755 | -0.096 | 0.19 | -0.187 | 0.285 |
| 85.99851245816289 | -0.098 | 0.191 | -0.184 | 0.284 |
| 86.16586091483823 | -0.099 | 0.193 | -0.181 | 0.284 |
| 86.33320937151358 | -0.101 | 0.193 | -0.179 | 0.283 |
| 86.50055782818893 | -0.102 | 0.196 | -0.177 | 0.285 |
| 86.66790628486427 | -0.103 | 0.2 | -0.175 | 0.287 |
| 86.83525474153961 | -0.105 | 0.204 | -0.173 | 0.289 |
| 87.00260319821496 | -0.107 | 0.207 | -0.171 | 0.291 |
| 87.16995165489031 | -0.107 | 0.21 | -0.169 | 0.293 |
| 87.33730011156564 | -0.108 | 0.214 | -0.167 | 0.294 |
| 87.504648568241 | -0.11 | 0.216 | -0.165 | 0.295 |
| 87.67199702491634 | -0.112 | 0.218 | -0.164 | 0.296 |
| 87.83004834510972 | -0.113 | 0.219 | -0.163 | 0.296 |
| 87.99739680178506 | -0.114 | 0.219 | -0.161 | 0.296 |
| 88.1647452584604 | -0.115 | 0.22 | -0.159 | 0.295 |
| 88.33209371513574 | -0.115 | 0.219 | -0.156 | 0.293 |
| 88.49944217181108 | -0.115 | 0.217 | -0.154 | 0.292 |
| 88.66679062848644 | -0.115 | 0.215 | -0.151 | 0.289 |
| 88.83413908516178 | -0.115 | 0.213 | -0.149 | 0.285 |
| 89.00148754183712 | -0.114 | 0.211 | -0.146 | 0.283 |
| 89.16883599851246 | -0.112 | 0.21 | -0.142 | 0.28 |
| 89.33618445518782 | -0.112 | 0.208 | -0.139 | 0.277 |
| 89.50353291186315 | -0.113 | 0.206 | -0.136 | 0.273 |
| 89.6708813685385 | -0.113 | 0.201 | -0.132 | 0.268 |
| 89.83822982521386 | -0.112 | 0.197 | -0.127 | 0.263 |
| 90.00557828188919 | -0.109 | 0.193 | -0.122 | 0.257 |
| 90.16362960208257 | -0.103 | 0.191 | -0.118 | 0.25 |
| 90.3309780587579 | -0.098 | 0.187 | -0.113 | 0.242 |
| 90.49832651543326 | -0.095 | 0.184 | -0.109 | 0.237 |
| 90.66567497210859 | -0.094 | 0.179 | -0.105 | 0.232 |
| 90.83302342878395 | -0.094 | 0.175 | -0.1 | 0.226 |
| 91.00037188545929 | -0.094 | 0.17 | -0.097 | 0.221 |
| 91.16772034213463 | -0.093 | 0.165 | -0.094 | 0.216 |
| 91.33506879880998 | -0.092 | 0.162 | -0.092 | 0.21 |
| 91.50241725548533 | -0.093 | 0.158 | -0.089 | 0.206 |
| 91.66976571216065 | -0.094 | 0.154 | -0.086 | 0.202 |
| 91.83711416883601 | -0.095 | 0.151 | -0.084 | 0.199 |
| 92.00446262551137 | -0.093 | 0.15 | -0.082 | 0.197 |
| 92.1718110821867 | -0.093 | 0.15 | -0.081 | 0.195 |
| 92.33915953886203 | -0.093 | 0.148 | -0.08 | 0.194 |
| 92.49721085905541 | -0.095 | 0.147 | -0.079 | 0.193 |
| 92.66455931573077 | -0.098 | 0.145 | -0.079 | 0.194 |
| 92.83190777240611 | -0.103 | 0.144 | -0.079 | 0.195 |
| 92.99925622908145 | -0.106 | 0.144 | -0.079 | 0.198 |
| 93.1666046857568 | -0.108 | 0.147 | -0.079 | 0.2 |
| 93.33395314243214 | -0.109 | 0.151 | -0.079 | 0.205 |
| 93.50130159910749 | -0.11 | 0.157 | -0.079 | 0.209 |
| 93.66865005578283 | -0.11 | 0.164 | -0.08 | 0.214 |
| 93.83599851245818 | -0.11 | 0.169 | -0.08 | 0.219 |
| 94.00334696913353 | -0.109 | 0.177 | -0.082 | 0.224 |
| 94.17069542580886 | -0.11 | 0.183 | -0.083 | 0.231 |
| 94.3380438824842 | -0.114 | 0.188 | -0.085 | 0.236 |
| 94.50539233915954 | -0.118 | 0.193 | -0.087 | 0.243 |
| 94.66344365935292 | -0.12 | 0.198 | -0.088 | 0.248 |
| 94.83079211602828 | -0.121 | 0.204 | -0.091 | 0.254 |
| 94.99814057270362 | -0.12 | 0.21 | -0.093 | 0.26 |
| 95.16548902937897 | -0.12 | 0.217 | -0.093 | 0.265 |
| 95.33283748605432 | -0.12 | 0.221 | -0.095 | 0.27 |
| 95.50018594272963 | -0.119 | 0.225 | -0.096 | 0.273 |
| 95.66753439940499 | -0.118 | 0.23 | -0.096 | 0.277 |
| 95.83488285608034 | -0.118 | 0.233 | -0.097 | 0.279 |
| 96.00223131275567 | -0.118 | 0.235 | -0.098 | 0.281 |
| 96.16957976943102 | -0.119 | 0.236 | -0.099 | 0.282 |
| 96.33692822610638 | -0.121 | 0.236 | -0.099 | 0.283 |
| 96.50427668278171 | -0.122 | 0.236 | -0.099 | 0.285 |
| 96.67162513945706 | -0.121 | 0.238 | -0.099 | 0.286 |
| 96.8389735961324 | -0.12 | 0.242 | -0.1 | 0.288 |
| 96.99702491632577 | -0.117 | 0.247 | -0.101 | 0.292 |
| 97.16437337300111 | -0.115 | 0.249 | -0.102 | 0.293 |
| 97.33172182967647 | -0.115 | 0.248 | -0.102 | 0.293 |
| 97.49907028635181 | -0.117 | 0.246 | -0.102 | 0.291 |
| 97.66641874302715 | -0.12 | 0.243 | -0.101 | 0.29 |
| 97.8337671997025 | -0.123 | 0.238 | -0.1 | 0.287 |
| 98.00111565637785 | -0.123 | 0.236 | -0.099 | 0.285 |
| 98.16846411305319 | -0.122 | 0.236 | -0.097 | 0.284 |
| 98.33581256972855 | -0.12 | 0.237 | -0.095 | 0.283 |
| 98.50316102640389 | -0.116 | 0.239 | -0.093 | 0.283 |
| 98.67050948307921 | -0.112 | 0.241 | -0.093 | 0.284 |
| 98.83785793975456 | -0.111 | 0.243 | -0.092 | 0.285 |
| 99.0052063964299 | -0.11 | 0.245 | -0.092 | 0.287 |
| 99.17255485310525 | -0.108 | 0.247 | -0.091 | 0.288 |
| 99.33060617329863 | -0.106 | 0.248 | -0.09 | 0.287 |
| 99.49795462997399 | -0.104 | 0.248 | -0.088 | 0.286 |
| 99.66530308664933 | -0.103 | 0.247 | -0.087 | 0.285 |
| 99.83265154332467 | -0.103 | 0.246 | -0.086 | 0.283 |
| 100.0 | -0.103 | 0.244 | -0.085 | 0.281 |